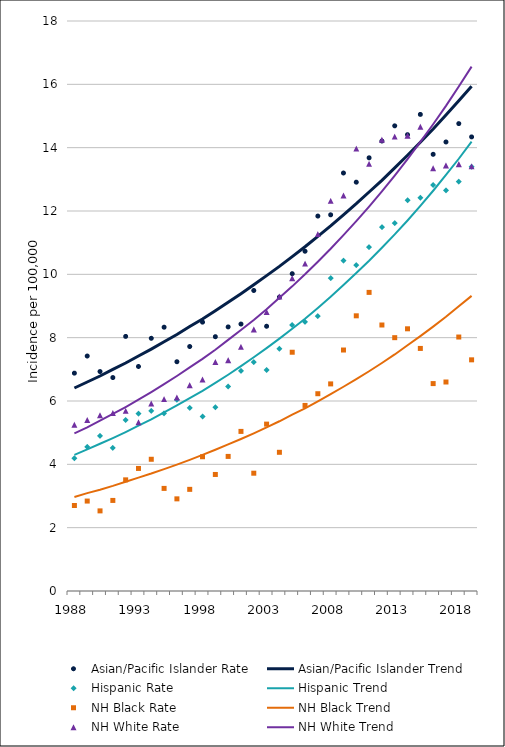
| Category | Asian/Pacific Islander Rate | Asian/Pacific Islander Trend | Hispanic Rate | Hispanic Trend | NH Black Rate | NH Black Trend | NH White Rate | NH White Trend |
|---|---|---|---|---|---|---|---|---|
| 1988.0 | 6.88 | 6.41 | 4.19 | 4.3 | 2.7 | 2.97 | 5.25 | 4.98 |
| 1989.0 | 7.42 | 6.6 | 4.55 | 4.47 | 2.84 | 3.09 | 5.4 | 5.17 |
| 1990.0 | 6.93 | 6.79 | 4.9 | 4.65 | 2.53 | 3.2 | 5.55 | 5.38 |
| 1991.0 | 6.74 | 7 | 4.52 | 4.83 | 2.86 | 3.32 | 5.62 | 5.59 |
| 1992.0 | 8.04 | 7.2 | 5.4 | 5.02 | 3.51 | 3.45 | 5.69 | 5.81 |
| 1993.0 | 7.09 | 7.42 | 5.6 | 5.22 | 3.87 | 3.58 | 5.33 | 6.04 |
| 1994.0 | 7.98 | 7.64 | 5.69 | 5.42 | 4.16 | 3.71 | 5.92 | 6.28 |
| 1995.0 | 8.33 | 7.87 | 5.61 | 5.64 | 3.24 | 3.85 | 6.06 | 6.53 |
| 1996.0 | 7.24 | 8.1 | 6.04 | 5.86 | 2.91 | 3.99 | 6.11 | 6.79 |
| 1997.0 | 7.72 | 8.35 | 5.78 | 6.09 | 3.21 | 4.14 | 6.5 | 7.06 |
| 1998.0 | 8.49 | 8.59 | 5.51 | 6.32 | 4.24 | 4.3 | 6.68 | 7.33 |
| 1999.0 | 8.03 | 8.85 | 5.8 | 6.57 | 3.68 | 4.46 | 7.23 | 7.62 |
| 2000.0 | 8.34 | 9.12 | 6.46 | 6.83 | 4.25 | 4.63 | 7.29 | 7.93 |
| 2001.0 | 8.43 | 9.39 | 6.95 | 7.1 | 5.04 | 4.8 | 7.71 | 8.24 |
| 2002.0 | 9.49 | 9.67 | 7.23 | 7.38 | 3.72 | 4.98 | 8.26 | 8.56 |
| 2003.0 | 8.36 | 9.96 | 6.98 | 7.67 | 5.27 | 5.17 | 8.81 | 8.9 |
| 2004.0 | 9.28 | 10.25 | 7.65 | 7.97 | 4.38 | 5.36 | 9.3 | 9.26 |
| 2005.0 | 10.02 | 10.56 | 8.4 | 8.28 | 7.54 | 5.57 | 9.88 | 9.62 |
| 2006.0 | 10.73 | 10.87 | 8.5 | 8.6 | 5.86 | 5.77 | 10.34 | 10 |
| 2007.0 | 11.84 | 11.2 | 8.68 | 8.94 | 6.23 | 5.99 | 11.27 | 10.4 |
| 2008.0 | 11.88 | 11.53 | 9.88 | 9.29 | 6.54 | 6.22 | 12.32 | 10.81 |
| 2009.0 | 13.2 | 11.88 | 10.43 | 9.66 | 7.61 | 6.45 | 12.49 | 11.24 |
| 2010.0 | 12.91 | 12.23 | 10.29 | 10.04 | 8.69 | 6.69 | 13.97 | 11.68 |
| 2011.0 | 13.68 | 12.6 | 10.86 | 10.43 | 9.43 | 6.94 | 13.49 | 12.14 |
| 2012.0 | 14.21 | 12.97 | 11.49 | 10.84 | 8.4 | 7.2 | 14.25 | 12.62 |
| 2013.0 | 14.69 | 13.36 | 11.62 | 11.26 | 8 | 7.47 | 14.35 | 13.12 |
| 2014.0 | 14.41 | 13.76 | 12.34 | 11.7 | 8.28 | 7.76 | 14.38 | 13.64 |
| 2015.0 | 15.05 | 14.17 | 12.42 | 12.16 | 7.66 | 8.05 | 14.66 | 14.18 |
| 2016.0 | 13.79 | 14.59 | 12.82 | 12.64 | 6.55 | 8.35 | 13.35 | 14.74 |
| 2017.0 | 14.18 | 15.03 | 12.65 | 13.14 | 6.6 | 8.66 | 13.44 | 15.32 |
| 2018.0 | 14.76 | 15.48 | 12.93 | 13.65 | 8.02 | 8.99 | 13.48 | 15.93 |
| 2019.0 | 14.34 | 15.94 | 13.4 | 14.19 | 7.3 | 9.32 | 13.41 | 16.56 |